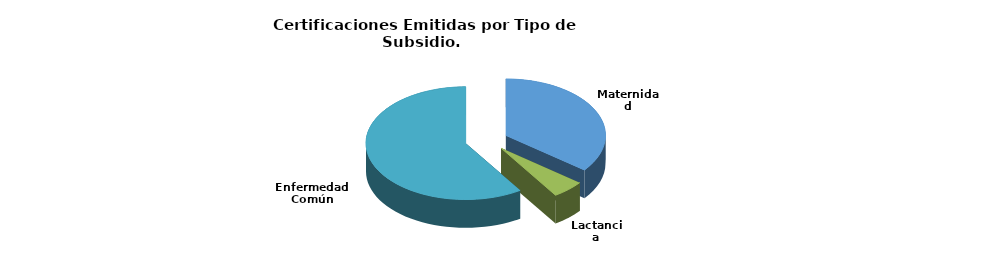
| Category | Total |
|---|---|
| Maternidad | 27 |
| Lactancia | 4 |
| Enfermedad Común | 45 |